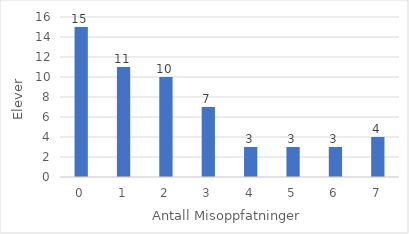
| Category | Series 0 |
|---|---|
| 0.0 | 15 |
| 1.0 | 11 |
| 2.0 | 10 |
| 3.0 | 7 |
| 4.0 | 3 |
| 5.0 | 3 |
| 6.0 | 3 |
| 7.0 | 4 |